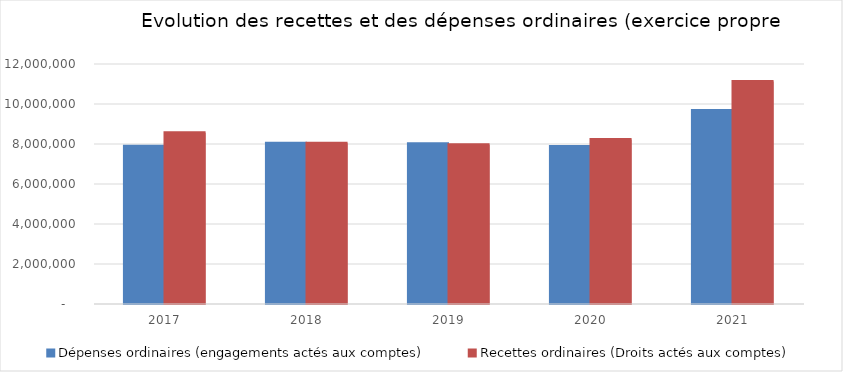
| Category | Dépenses ordinaires (engagements actés aux comptes) | Recettes ordinaires (Droits actés aux comptes) |
|---|---|---|
| 2017.0 | 7889379.44 | 8559818.41 |
| 2018.0 | 8031594.19 | 8032885.34 |
| 2019.0 | 8012967.69 | 7963043.07 |
| 2020.0 | 7875435.81 | 8221047.49 |
| 2021.0 | 9670836.16 | 11123711.89 |